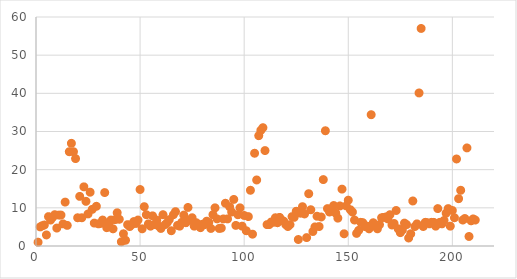
| Category | Series 0 |
|---|---|
| 0 | 1 |
| 1 | 5 |
| 2 | 5.3 |
| 3 | 5.5 |
| 4 | 2.9 |
| 5 | 7.7 |
| 6 | 6.8 |
| 7 | 7.5 |
| 8 | 8.2 |
| 9 | 4.7 |
| 10 | 8.1 |
| 11 | 8.1 |
| 12 | 5.8 |
| 13 | 11.5 |
| 14 | 5.4 |
| 15 | 24.7 |
| 16 | 26.9 |
| 17 | 24.7 |
| 18 | 22.9 |
| 19 | 7.4 |
| 20 | 13 |
| 21 | 7.4 |
| 22 | 15.5 |
| 23 | 11.7 |
| 24 | 8.4 |
| 25 | 14.1 |
| 26 | 9.6 |
| 27 | 6 |
| 28 | 10.4 |
| 29 | 5.8 |
| 30 | 5.9 |
| 31 | 6.8 |
| 32 | 14 |
| 33 | 4.8 |
| 34 | 5.8 |
| 35 | 6.8 |
| 36 | 4.5 |
| 37 | 6.9 |
| 38 | 8.7 |
| 39 | 7 |
| 40 | 1.1 |
| 41 | 3.2 |
| 42 | 1.5 |
| 43 | 5.6 |
| 44 | 5.1 |
| 45 | 5.6 |
| 46 | 6.4 |
| 47 | 5.9 |
| 48 | 6.8 |
| 49 | 14.8 |
| 50 | 4.5 |
| 51 | 10.3 |
| 52 | 8.2 |
| 53 | 5.8 |
| 54 | 5.2 |
| 55 | 7.9 |
| 56 | 5.6 |
| 57 | 6.8 |
| 58 | 5.2 |
| 59 | 4.6 |
| 60 | 8.2 |
| 61 | 5.6 |
| 62 | 6.1 |
| 63 | 6.9 |
| 64 | 4 |
| 65 | 8.2 |
| 66 | 9 |
| 67 | 5.4 |
| 68 | 5.2 |
| 69 | 6.2 |
| 70 | 8.1 |
| 71 | 6.1 |
| 72 | 10.1 |
| 73 | 6.8 |
| 74 | 7.4 |
| 75 | 5.2 |
| 76 | 6.1 |
| 77 | 5.6 |
| 78 | 4.8 |
| 79 | 5.7 |
| 80 | 5.6 |
| 81 | 6.5 |
| 82 | 6.2 |
| 83 | 4.6 |
| 84 | 8.2 |
| 85 | 10 |
| 86 | 7.1 |
| 87 | 4.6 |
| 88 | 4.7 |
| 89 | 7.1 |
| 90 | 11.2 |
| 91 | 7.1 |
| 92 | 10.3 |
| 93 | 8.9 |
| 94 | 12.2 |
| 95 | 5.4 |
| 96 | 8.2 |
| 97 | 10 |
| 98 | 5.2 |
| 99 | 8 |
| 100 | 4 |
| 101 | 7.7 |
| 102 | 14.6 |
| 103 | 3.1 |
| 104 | 24.3 |
| 105 | 17.3 |
| 106 | 28.9 |
| 107 | 30.3 |
| 108 | 31 |
| 109 | 25 |
| 110 | 5.6 |
| 111 | 5.6 |
| 112 | 6.3 |
| 113 | 6.2 |
| 114 | 7.4 |
| 115 | 6.1 |
| 116 | 7.5 |
| 117 | 6.8 |
| 118 | 6.5 |
| 119 | 5.6 |
| 120 | 5.1 |
| 121 | 5.6 |
| 122 | 7.7 |
| 123 | 7.5 |
| 124 | 9.1 |
| 125 | 1.7 |
| 126 | 8.6 |
| 127 | 10.3 |
| 128 | 8.4 |
| 129 | 2.2 |
| 130 | 13.7 |
| 131 | 9.5 |
| 132 | 3.8 |
| 133 | 5 |
| 134 | 7.8 |
| 135 | 5.1 |
| 136 | 7.6 |
| 137 | 17.4 |
| 138 | 30.2 |
| 139 | 9.8 |
| 140 | 8.9 |
| 141 | 9.8 |
| 142 | 10.6 |
| 143 | 8.6 |
| 144 | 7.3 |
| 145 | 10.5 |
| 146 | 14.9 |
| 147 | 3.2 |
| 148 | 10.5 |
| 149 | 12 |
| 150 | 9.5 |
| 151 | 8.9 |
| 152 | 6.8 |
| 153 | 3.3 |
| 154 | 4.1 |
| 155 | 6.2 |
| 156 | 6.1 |
| 157 | 5.1 |
| 158 | 5.2 |
| 159 | 4.5 |
| 160 | 34.4 |
| 161 | 6.1 |
| 162 | 5.2 |
| 163 | 4.5 |
| 164 | 5.6 |
| 165 | 7.4 |
| 166 | 7.5 |
| 167 | 7.6 |
| 168 | 7.1 |
| 169 | 8.2 |
| 170 | 5.5 |
| 171 | 5.9 |
| 172 | 9.3 |
| 173 | 4.5 |
| 174 | 3.5 |
| 175 | 4.2 |
| 176 | 6 |
| 177 | 5.6 |
| 178 | 2.1 |
| 179 | 3.2 |
| 180 | 11.8 |
| 181 | 5.1 |
| 182 | 5.8 |
| 183 | 40.1 |
| 184 | 57 |
| 185 | 5.1 |
| 186 | 6.2 |
| 187 | 6.1 |
| 188 | 5.8 |
| 189 | 6.2 |
| 190 | 6.2 |
| 191 | 5.2 |
| 192 | 9.8 |
| 193 | 6.2 |
| 194 | 5.8 |
| 195 | 6.7 |
| 196 | 8.6 |
| 197 | 9.8 |
| 198 | 5.2 |
| 199 | 9.3 |
| 200 | 7.4 |
| 201 | 22.8 |
| 202 | 12.4 |
| 203 | 14.6 |
| 204 | 6.8 |
| 205 | 7.2 |
| 206 | 25.7 |
| 207 | 2.5 |
| 208 | 6.6 |
| 209 | 7.1 |
| 210 | 6.8 |